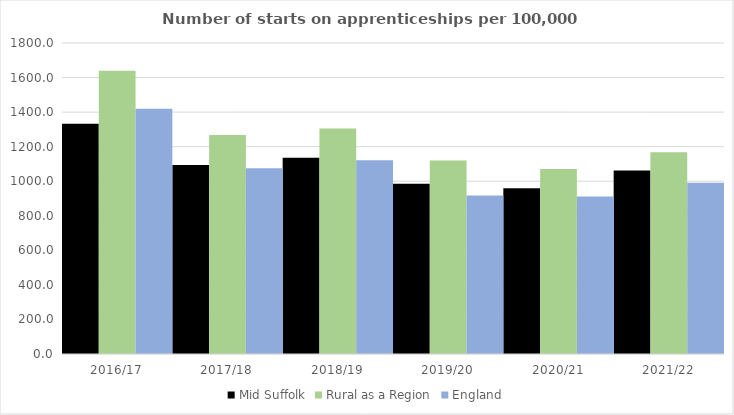
| Category | Mid Suffolk | Rural as a Region | England |
|---|---|---|---|
| 2016/17 | 1332 | 1638.789 | 1420 |
| 2017/18 | 1094 | 1267.474 | 1075 |
| 2018/19 | 1136 | 1304.57 | 1122 |
| 2019/20 | 985 | 1119.662 | 918 |
| 2020/21 | 959 | 1070.748 | 912 |
| 2021/22 | 1062 | 1167.68 | 991 |